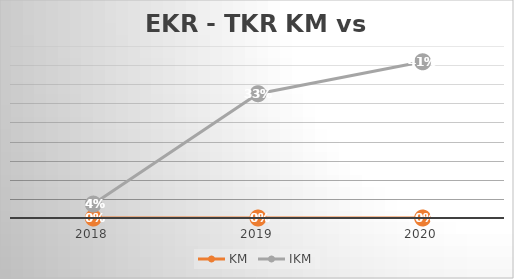
| Category | KM | IKM |
|---|---|---|
| 2018.0 | 0 | 0.036 |
| 2019.0 | 0 | 0.325 |
| 2020.0 | 0 | 0.409 |